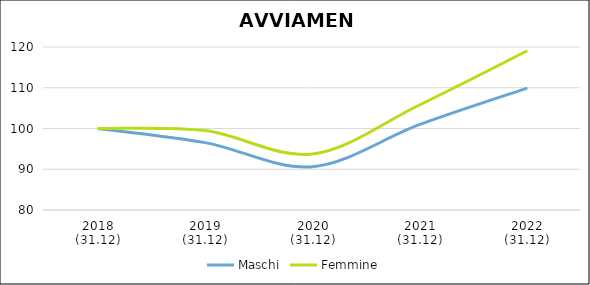
| Category | Maschi | Femmine |
|---|---|---|
| 2018
(31.12) | 100 | 100 |
| 2019
(31.12) | 96.538 | 99.486 |
| 2020
(31.12) | 90.615 | 93.728 |
| 2021
(31.12) | 100.992 | 105.834 |
| 2022
(31.12) | 109.925 | 119.076 |